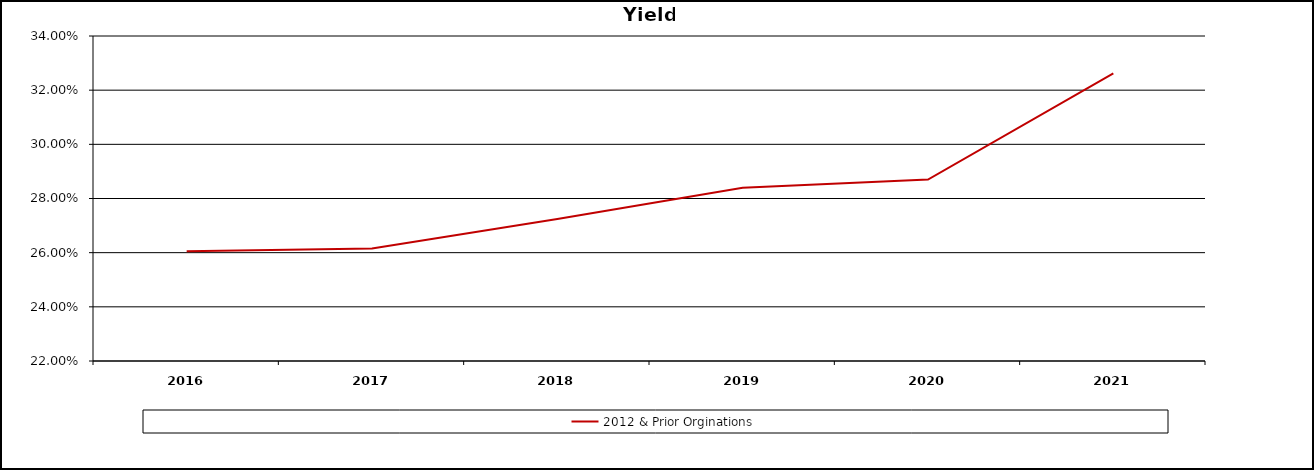
| Category | 2012 & Prior Orginations  |
|---|---|
| 2016.0 | 0.26 |
| 2017.0 | 0.262 |
| 2018.0 | 0.272 |
| 2019.0 | 0.284 |
| 2020.0 | 0.287 |
| 2021.0 | 0.326 |